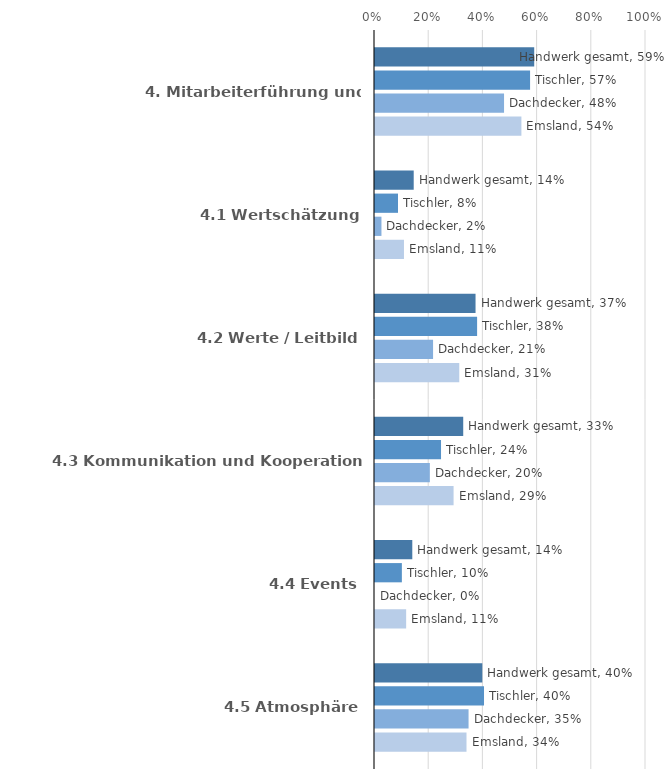
| Category | Handwerk gesamt | Tischler | Dachdecker | Emsland |
|---|---|---|---|---|
| 4. Mitarbeiterführung und Unternehmenskultur | 0.587 | 0.572 | 0.476 | 0.54 |
| 4.1 Wertschätzung | 0.143 | 0.085 | 0.024 | 0.107 |
| 4.2 Werte / Leitbild | 0.371 | 0.377 | 0.214 | 0.311 |
| 4.3 Kommunikation und Kooperation | 0.326 | 0.244 | 0.202 | 0.29 |
| 4.4 Events | 0.138 | 0.099 | 0 | 0.115 |
| 4.5 Atmosphäre | 0.396 | 0.402 | 0.345 | 0.338 |